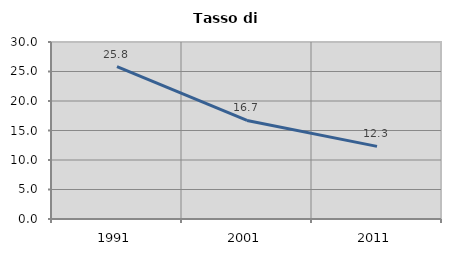
| Category | Tasso di disoccupazione   |
|---|---|
| 1991.0 | 25.814 |
| 2001.0 | 16.707 |
| 2011.0 | 12.314 |